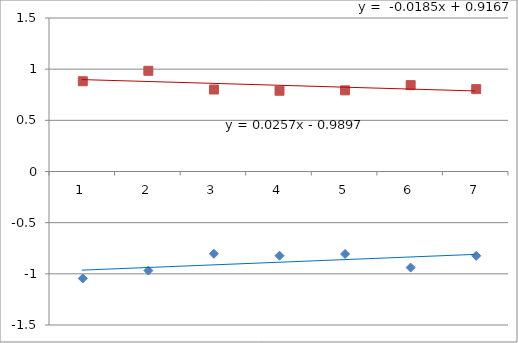
| Category | Series 0 | Series 1 |
|---|---|---|
| 0 | -1.045 | 0.882 |
| 1 | -0.968 | 0.984 |
| 2 | -0.804 | 0.801 |
| 3 | -0.823 | 0.789 |
| 4 | -0.806 | 0.793 |
| 5 | -0.939 | 0.844 |
| 6 | -0.824 | 0.805 |